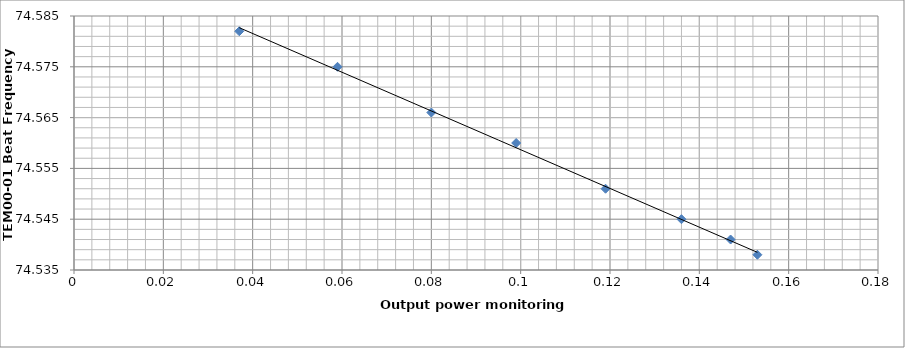
| Category | Series 0 |
|---|---|
| 0.153 | 74.538 |
| 0.147 | 74.541 |
| 0.136 | 74.545 |
| 0.119 | 74.551 |
| 0.099 | 74.56 |
| 0.08 | 74.566 |
| 0.059 | 74.575 |
| 0.037 | 74.582 |